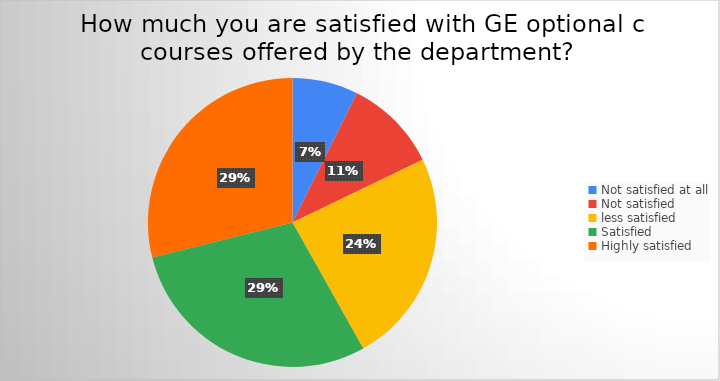
| Category | Series 0 |
|---|---|
| Not satisfied at all | 42 |
| Not satisfied  | 60 |
| less satisfied | 137 |
| Satisfied | 167 |
| Highly satisfied | 165 |